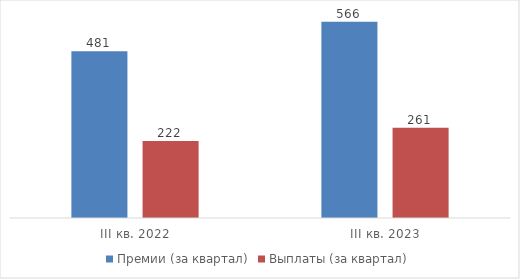
| Category | Премии (за квартал) | Выплаты (за квартал) |
|---|---|---|
| III кв. 2022 | 481.125 | 221.938 |
| III кв. 2023 | 566.019 | 260.687 |